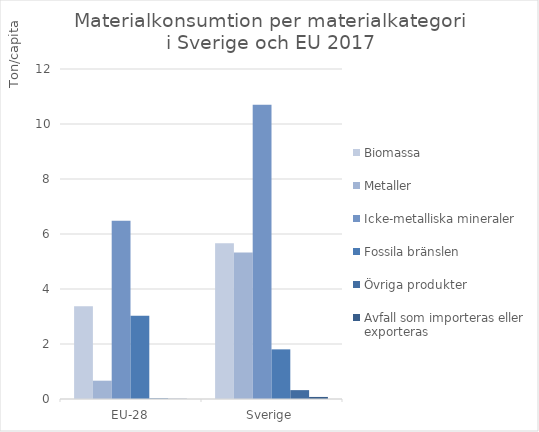
| Category | Biomassa | Metaller | Icke-metalliska mineraler | Fossila bränslen | Övriga produkter | Avfall som importeras eller exporteras |
|---|---|---|---|---|---|---|
| EU-28 | 3.376 | 0.666 | 6.48 | 3.028 | 0.021 | 0.007 |
| Sverige | 5.661 | 5.325 | 10.7 | 1.805 | 0.323 | 0.075 |